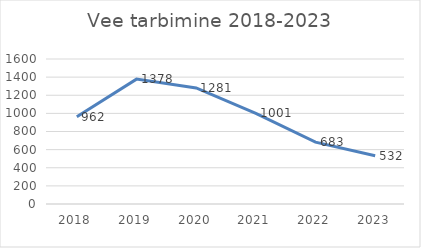
| Category | Series 0 |
|---|---|
| 2018.0 | 962 |
| 2019.0 | 1378 |
| 2020.0 | 1281 |
| 2021.0 | 1001 |
| 2022.0 | 683 |
| 2023.0 | 532 |